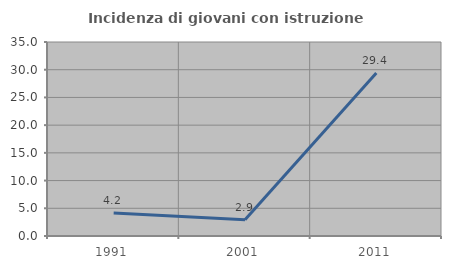
| Category | Incidenza di giovani con istruzione universitaria |
|---|---|
| 1991.0 | 4.167 |
| 2001.0 | 2.941 |
| 2011.0 | 29.412 |